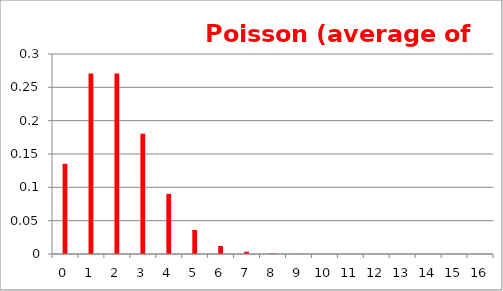
| Category | Series 0 |
|---|---|
| 0.0 | 0.135 |
| 1.0 | 0.271 |
| 2.0 | 0.271 |
| 3.0 | 0.18 |
| 4.0 | 0.09 |
| 5.0 | 0.036 |
| 6.0 | 0.012 |
| 7.0 | 0.003 |
| 8.0 | 0.001 |
| 9.0 | 0 |
| 10.0 | 0 |
| 11.0 | 0 |
| 12.0 | 0 |
| 13.0 | 0 |
| 14.0 | 0 |
| 15.0 | 0 |
| 16.0 | 0 |